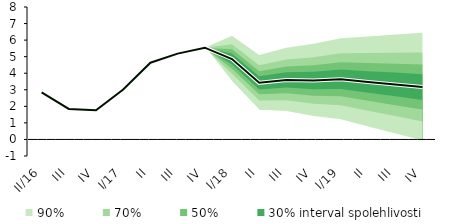
| Category | linka | Centerline |
|---|---|---|
| II/16 | 2.848 | 2.848 |
| III | 1.844 | 1.844 |
| IV | 1.766 | 1.766 |
| I/17 | 3.021 | 3.021 |
| II | 4.636 | 4.636 |
| III | 5.185 | 5.185 |
| IV | 5.543 | 5.543 |
| I/18 | 4.857 | 4.857 |
| II | 3.421 | 3.421 |
| III | 3.597 | 3.597 |
| IV | 3.562 | 3.562 |
| I/19 | 3.634 | 3.634 |
| II | 3.473 | 3.473 |
| III | 3.321 | 3.321 |
| IV | 3.165 | 3.165 |